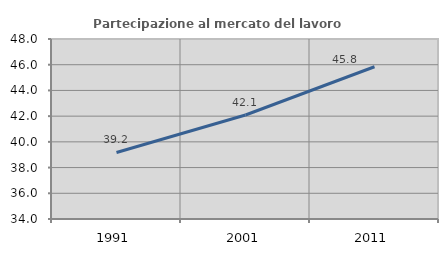
| Category | Partecipazione al mercato del lavoro  femminile |
|---|---|
| 1991.0 | 39.175 |
| 2001.0 | 42.09 |
| 2011.0 | 45.841 |